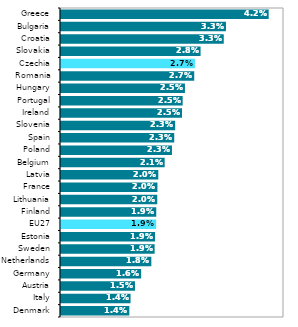
| Category | Series 1 |
|---|---|
| Denmark | 0.014 |
| Italy | 0.014 |
| Austria | 0.015 |
| Germany | 0.016 |
| Netherlands | 0.018 |
| Sweden | 0.019 |
| Estonia | 0.019 |
| EU27 | 0.019 |
| Finland | 0.019 |
| Lithuania | 0.02 |
| France | 0.02 |
| Latvia | 0.02 |
| Belgium | 0.021 |
| Poland | 0.023 |
| Spain | 0.023 |
| Slovenia | 0.023 |
| Ireland | 0.025 |
| Portugal | 0.025 |
| Hungary | 0.025 |
| Romania | 0.027 |
| Czechia | 0.027 |
| Slovakia | 0.028 |
| Croatia | 0.033 |
| Bulgaria | 0.033 |
| Greece | 0.042 |